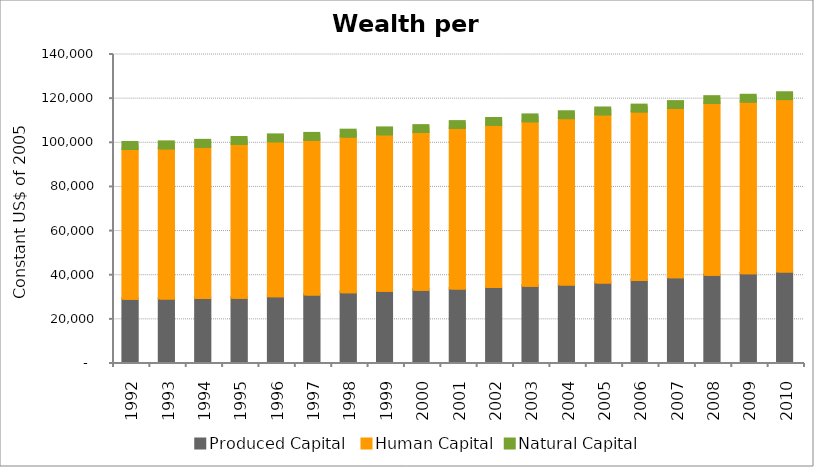
| Category | Produced Capital  | Human Capital | Natural Capital |
|---|---|---|---|
| 1992.0 | 28615.068 | 67905.753 | 2948.605 |
| 1993.0 | 28813.982 | 67979.056 | 2937.666 |
| 1994.0 | 28975.876 | 68523.012 | 2927.562 |
| 1995.0 | 29151.983 | 69655.781 | 2918.375 |
| 1996.0 | 29759.108 | 70222.569 | 2910.837 |
| 1997.0 | 30608.438 | 70056.848 | 2904.822 |
| 1998.0 | 31628.891 | 70501.437 | 2900.403 |
| 1999.0 | 32258.766 | 70897.865 | 2898.157 |
| 2000.0 | 32684.976 | 71516.076 | 2897.188 |
| 2001.0 | 33325.392 | 72695.023 | 2897.389 |
| 2002.0 | 33949.613 | 73491.932 | 2895.815 |
| 2003.0 | 34496.31 | 74557.819 | 2895.17 |
| 2004.0 | 35104.556 | 75380.958 | 2894.114 |
| 2005.0 | 36025.341 | 76169.932 | 2892.564 |
| 2006.0 | 37114.621 | 76386.894 | 2887.038 |
| 2007.0 | 38365.091 | 76725.111 | 2883.728 |
| 2008.0 | 39575.162 | 77760.037 | 2877.662 |
| 2009.0 | 40173.724 | 77796.631 | 2872.492 |
| 2010.0 | 41025.487 | 78091.046 | 2867.998 |